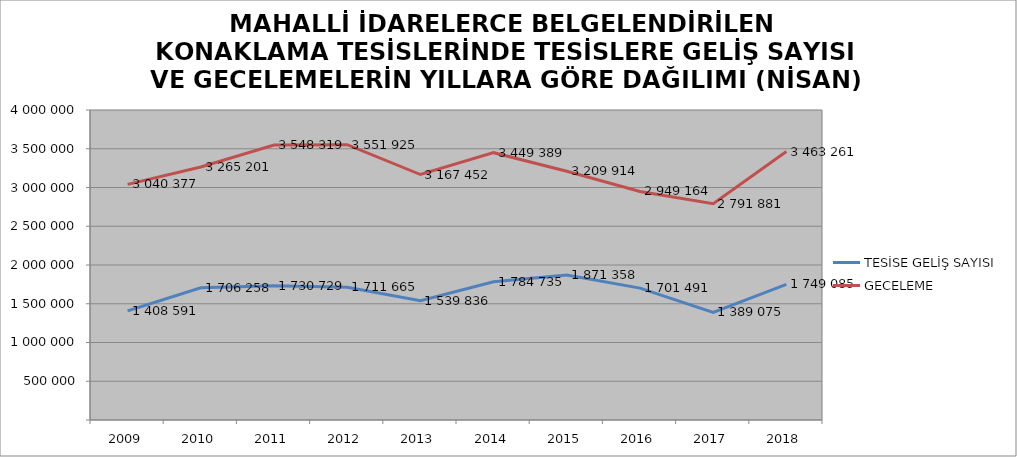
| Category | TESİSE GELİŞ SAYISI | GECELEME |
|---|---|---|
| 2009 | 1408591 | 3040377 |
| 2010 | 1706258 | 3265201 |
| 2011 | 1730729 | 3548319 |
| 2012 | 1711665 | 3551925 |
| 2013 | 1539836 | 3167452 |
| 2014 | 1784735 | 3449389 |
| 2015 | 1871358 | 3209914 |
| 2016 | 1701491 | 2949164 |
| 2017 | 1389075 | 2791881 |
| 2018 | 1749085 | 3463261 |